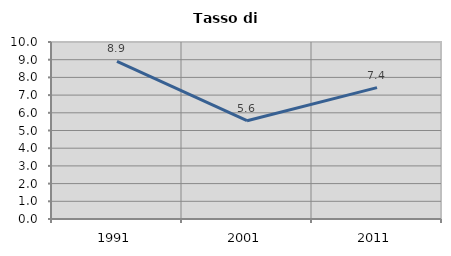
| Category | Tasso di disoccupazione   |
|---|---|
| 1991.0 | 8.9 |
| 2001.0 | 5.553 |
| 2011.0 | 7.424 |